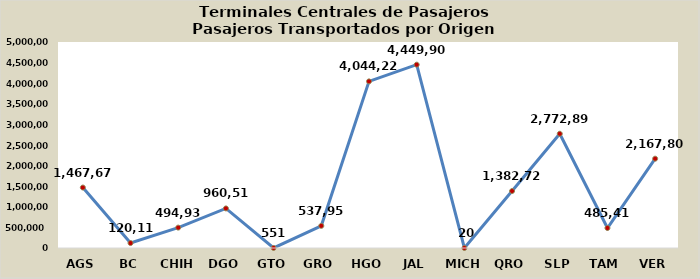
| Category | TOTAL |
|---|---|
| AGS | 1467678 |
| BC | 120119 |
| CHIH | 494937 |
| DGO | 960519 |
| GTO | 551 |
| GRO | 537951 |
| HGO | 4044225 |
| JAL | 4449907 |
| MICH | 20 |
| QRO | 1382723.5 |
| SLP | 2772894 |
| TAM | 485414.8 |
| VER | 2167802 |